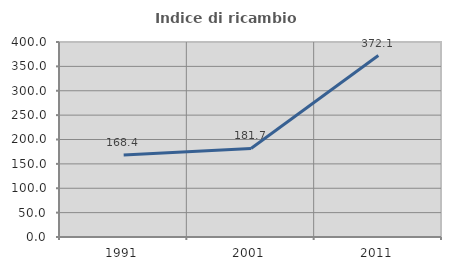
| Category | Indice di ricambio occupazionale  |
|---|---|
| 1991.0 | 168.391 |
| 2001.0 | 181.707 |
| 2011.0 | 372.131 |